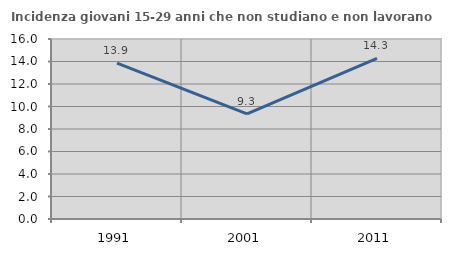
| Category | Incidenza giovani 15-29 anni che non studiano e non lavorano  |
|---|---|
| 1991.0 | 13.855 |
| 2001.0 | 9.346 |
| 2011.0 | 14.286 |